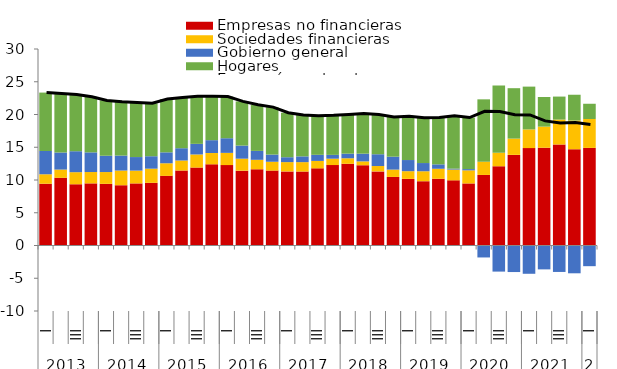
| Category | Empresas no financieras | Sociedades financieras | Gobierno general | Hogares |
|---|---|---|---|---|
| 0 | 9.43 | 1.445 | 3.552 | 8.92 |
| 1 | 10.334 | 1.259 | 2.606 | 9.016 |
| 2 | 9.351 | 1.843 | 3.2 | 8.661 |
| 3 | 9.485 | 1.731 | 3.004 | 8.482 |
| 4 | 9.413 | 1.801 | 2.489 | 8.448 |
| 5 | 9.201 | 2.243 | 2.283 | 8.221 |
| 6 | 9.48 | 1.954 | 2.069 | 8.33 |
| 7 | 9.568 | 2.162 | 1.899 | 8.08 |
| 8 | 10.63 | 1.925 | 1.669 | 8.127 |
| 9 | 11.447 | 1.528 | 1.879 | 7.743 |
| 10 | 11.898 | 2.001 | 1.618 | 7.259 |
| 11 | 12.394 | 1.724 | 1.963 | 6.697 |
| 12 | 12.277 | 1.865 | 2.236 | 6.354 |
| 13 | 11.426 | 1.831 | 1.997 | 6.748 |
| 14 | 11.637 | 1.446 | 1.36 | 7.041 |
| 15 | 11.439 | 1.346 | 1.097 | 7.245 |
| 16 | 11.311 | 1.42 | 0.746 | 6.8 |
| 17 | 11.291 | 1.436 | 0.88 | 6.318 |
| 18 | 11.776 | 1.138 | 0.932 | 5.956 |
| 19 | 12.281 | 0.974 | 0.582 | 6.038 |
| 20 | 12.476 | 0.841 | 0.705 | 5.99 |
| 21 | 12.254 | 0.59 | 1.178 | 6.146 |
| 22 | 11.315 | 0.817 | 1.8 | 6.062 |
| 23 | 10.466 | 1.122 | 1.973 | 6.073 |
| 24 | 10.169 | 1.178 | 1.702 | 6.674 |
| 25 | 9.817 | 1.518 | 1.255 | 6.927 |
| 26 | 10.189 | 1.527 | 0.672 | 7.138 |
| 27 | 9.948 | 1.644 | 0.142 | 8.091 |
| 28 | 9.476 | 1.998 | 0.192 | 7.866 |
| 29 | 10.772 | 2.015 | -1.825 | 9.528 |
| 30 | 12.099 | 2.059 | -3.985 | 10.285 |
| 31 | 13.836 | 2.485 | -4.053 | 7.696 |
| 32 | 14.869 | 2.854 | -4.317 | 6.535 |
| 33 | 14.926 | 3.223 | -3.646 | 4.525 |
| 34 | 15.42 | 3.806 | -4.037 | 3.511 |
| 35 | 14.695 | 4.382 | -4.243 | 3.938 |
| 36 | 14.898 | 4.419 | -3.157 | 2.323 |